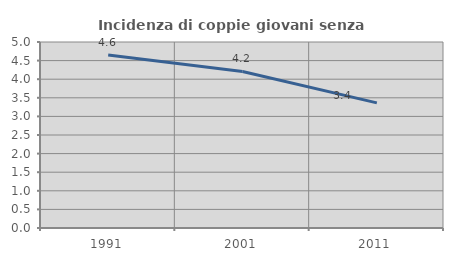
| Category | Incidenza di coppie giovani senza figli |
|---|---|
| 1991.0 | 4.649 |
| 2001.0 | 4.208 |
| 2011.0 | 3.363 |